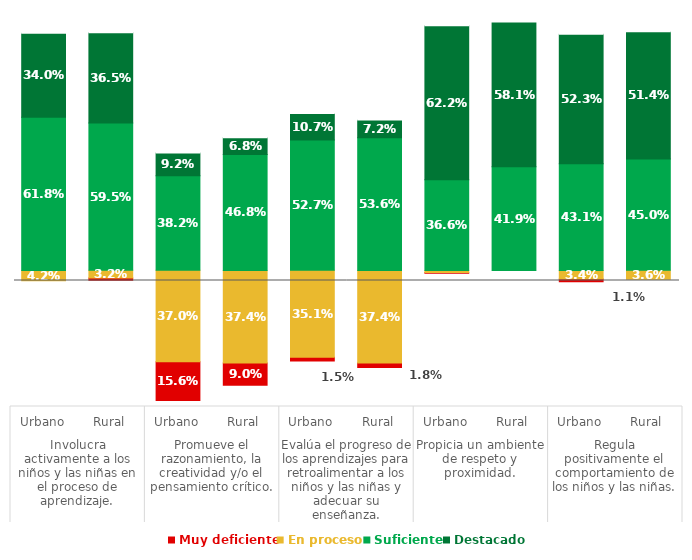
| Category | Series 0 | Muy deficiente | En proceso | Suficiente | Destacado | Series 5 |
|---|---|---|---|---|---|---|
| 0 | 0.508 | 0 | 0.042 | 0.618 | 0.34 | 0.042 |
| 1 | 0.51 | 0.009 | 0.032 | 0.595 | 0.365 | 0.04 |
| 2 | 0.024 | 0.156 | 0.37 | 0.382 | 0.092 | 0.526 |
| 3 | 0.086 | 0.09 | 0.374 | 0.468 | 0.068 | 0.464 |
| 4 | 0.184 | 0.015 | 0.351 | 0.527 | 0.107 | 0.366 |
| 5 | 0.158 | 0.018 | 0.374 | 0.536 | 0.072 | 0.392 |
| 6 | 0.538 | 0.004 | 0.008 | 0.366 | 0.622 | 0.012 |
| 7 | 0.55 | 0 | 0 | 0.419 | 0.581 | 0 |
| 8 | 0.504 | 0.011 | 0.034 | 0.431 | 0.523 | 0.046 |
| 9 | 0.514 | 0 | 0.036 | 0.45 | 0.514 | 0.036 |